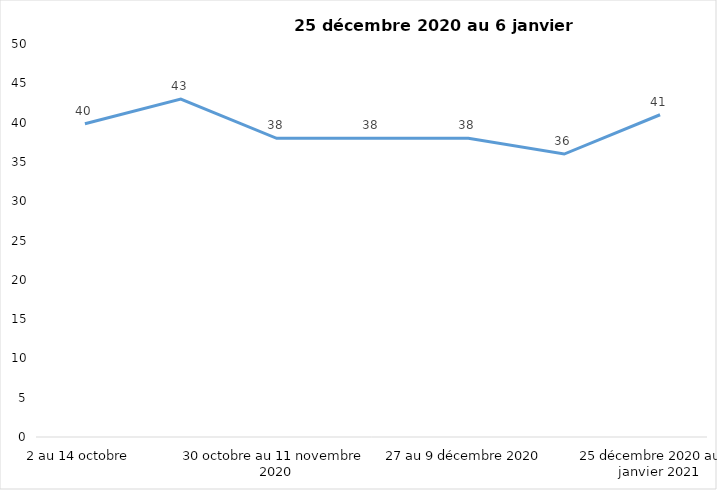
| Category | Toujours aux trois mesures |
|---|---|
| 2 au 14 octobre  | 39.85 |
| 16 au 28 octobre 2020 | 43 |
| 30 octobre au 11 novembre 2020 | 38 |
| 13 au 25 novembre 2020 | 38 |
| 27 au 9 décembre 2020 | 38 |
| 11 au 25 décembre 2020 | 36 |
| 25 décembre 2020 au 6 janvier 2021 | 41 |